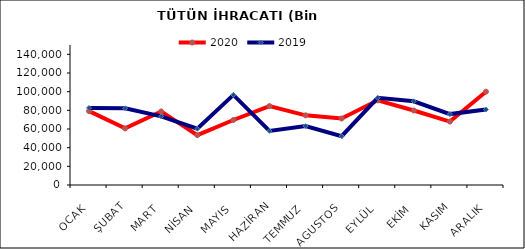
| Category | 2020 | 2019 |
|---|---|---|
| OCAK | 79131.446 | 82543.429 |
| ŞUBAT | 60671.368 | 82148.817 |
| MART | 78806.018 | 73557.319 |
| NİSAN | 53409.439 | 60277.45 |
| MAYIS | 69658.718 | 96526.273 |
| HAZİRAN | 84526.764 | 57984.925 |
| TEMMUZ | 74619.318 | 63096.188 |
| AGUSTOS | 71254.858 | 52338.667 |
| EYLÜL | 90724.827 | 93408.118 |
| EKİM | 79811.92 | 89707.537 |
| KASIM | 67968.792 | 75957.009 |
| ARALIK | 99947.395 | 80871.44 |